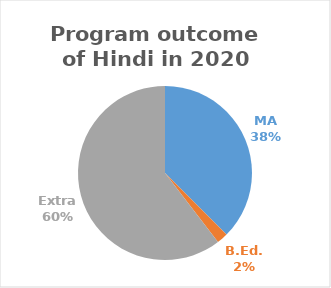
| Category | Series 0 |
|---|---|
| MA | 18 |
| B.Ed. | 1 |
| Extra | 29 |